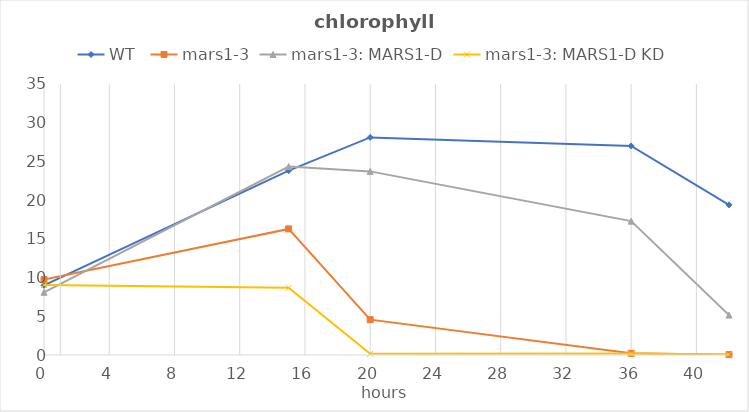
| Category | WT  | mars1-3 | mars1-3: MARS1-D | mars1-3: MARS1-D KD |
|---|---|---|---|---|
| 0.0 | 8.997 | 9.732 | 8.096 | 9.035 |
| 15.0 | 23.81 | 16.284 | 24.335 | 8.674 |
| 20.0 | 28.1 | 4.564 | 23.714 | 0.159 |
| 36.0 | 26.998 | 0.214 | 17.289 | 0.19 |
| 42.0 | 19.388 | 0.047 | 5.154 | 0.049 |